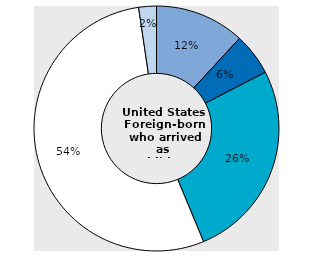
| Category | Series 1 |
|---|---|
| Europe | 11.839 |
| Africa | 5.573 |
| Asia | 26.316 |
| Latin America | 53.937 |
| North America and Oceania | 2.335 |